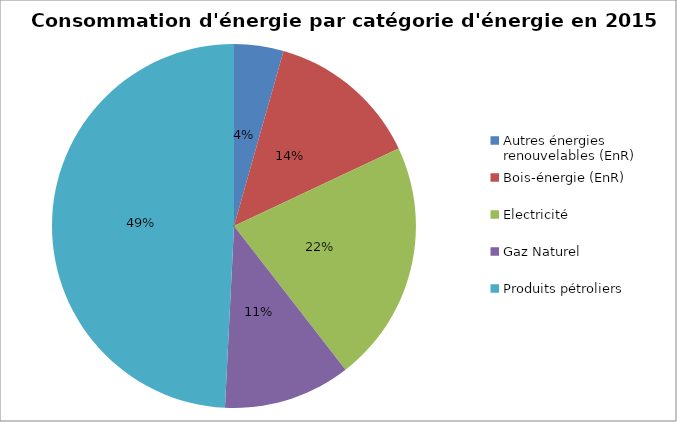
| Category | Series 0 |
|---|---|
| Autres énergies renouvelables (EnR) | 9411.439 |
| Bois-énergie (EnR) | 29142.075 |
| Electricité | 46098.374 |
| Gaz Naturel | 24195.834 |
| Produits pétroliers | 105456.186 |